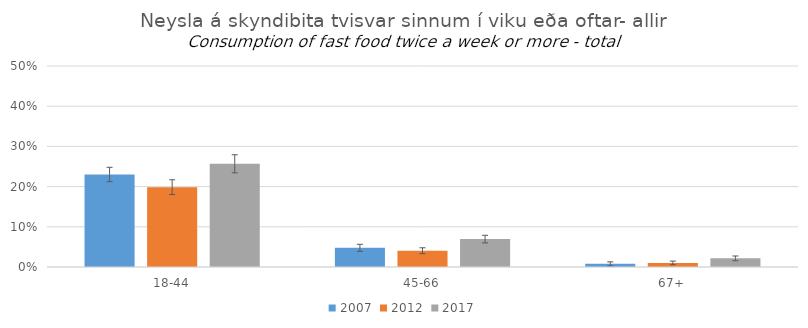
| Category | 2007 | 2012 | 2017 |
|---|---|---|---|
| 18-44 | 0.23 | 0.199 | 0.257 |
| 45-66 | 0.048 | 0.041 | 0.069 |
| 67+ | 0.008 | 0.01 | 0.022 |